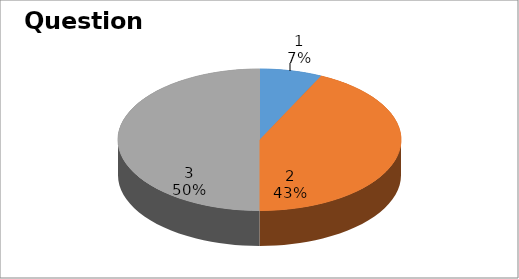
| Category | Series 0 |
|---|---|
| 0 | 1 |
| 1 | 6 |
| 2 | 7 |